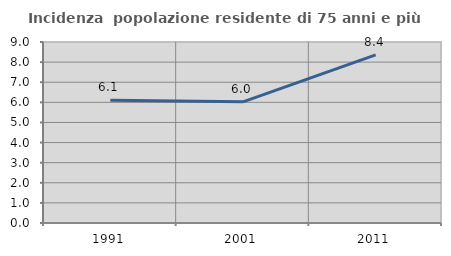
| Category | Incidenza  popolazione residente di 75 anni e più |
|---|---|
| 1991.0 | 6.107 |
| 2001.0 | 6.024 |
| 2011.0 | 8.363 |